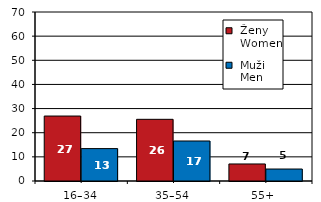
| Category |  Ženy 
 Women |  Muži 
 Men |
|---|---|---|
| 16–34 | 26.91 | 13.42 |
| 35–54 | 25.55 | 16.57 |
| 55+  | 7.06 | 4.96 |